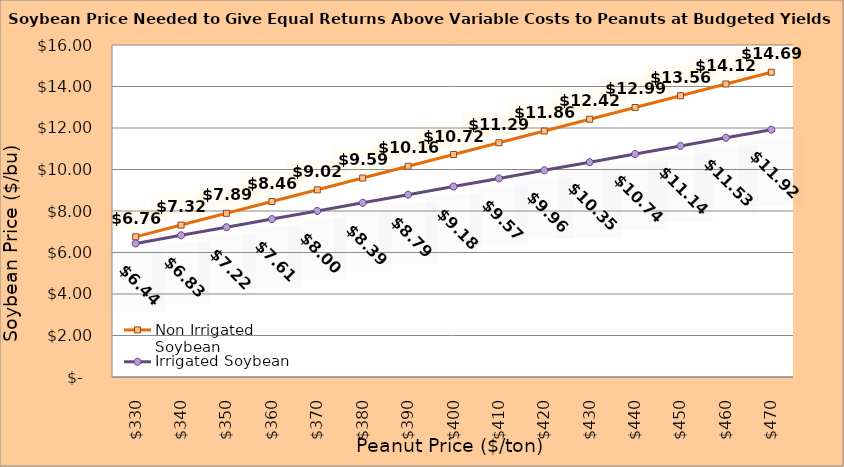
| Category | Non Irrigated Soybean | Irrigated Soybean |
|---|---|---|
| 330.0 | 6.755 | 6.437 |
| 340.0 | 7.322 | 6.828 |
| 350.0 | 7.888 | 7.22 |
| 360.0 | 8.455 | 7.612 |
| 370.0 | 9.022 | 8.003 |
| 380.0 | 9.588 | 8.395 |
| 390.0 | 10.155 | 8.787 |
| 400.0 | 10.722 | 9.178 |
| 410.0 | 11.288 | 9.57 |
| 420.0 | 11.855 | 9.962 |
| 430.0 | 12.422 | 10.353 |
| 440.0 | 12.988 | 10.745 |
| 450.0 | 13.555 | 11.137 |
| 460.0 | 14.122 | 11.528 |
| 470.0 | 14.688 | 11.92 |